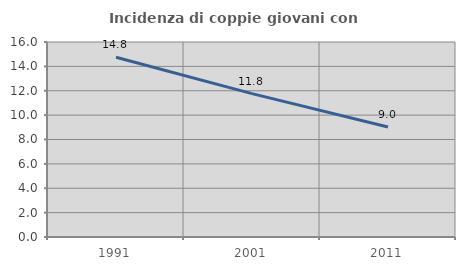
| Category | Incidenza di coppie giovani con figli |
|---|---|
| 1991.0 | 14.754 |
| 2001.0 | 11.765 |
| 2011.0 | 9.028 |